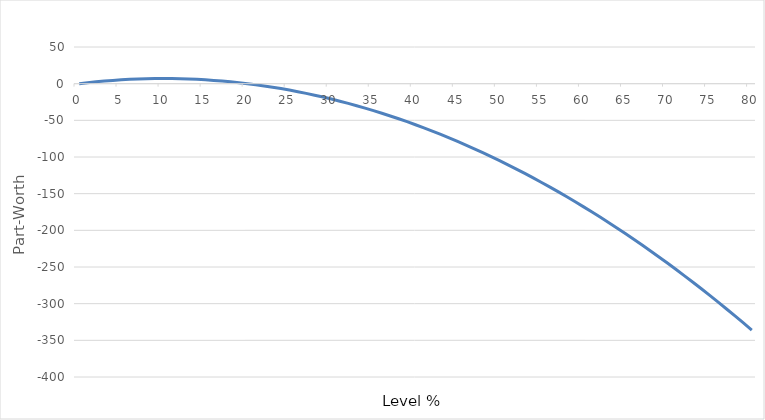
| Category | Utility |
|---|---|
| 0.0 | 0 |
| 1.0 | 1.33 |
| 2.0 | 2.52 |
| 3.0 | 3.57 |
| 4.0 | 4.48 |
| 5.0 | 5.25 |
| 6.0 | 5.88 |
| 7.0 | 6.37 |
| 8.0 | 6.72 |
| 9.0 | 6.93 |
| 10.0 | 7 |
| 11.0 | 6.93 |
| 12.0 | 6.72 |
| 13.0 | 6.37 |
| 14.0 | 5.88 |
| 15.0 | 5.25 |
| 16.0 | 4.48 |
| 17.0 | 3.57 |
| 18.0 | 2.52 |
| 19.0 | 1.33 |
| 20.0 | 0 |
| 21.0 | -1.47 |
| 22.0 | -3.08 |
| 23.0 | -4.83 |
| 24.0 | -6.72 |
| 25.0 | -8.75 |
| 26.0 | -10.92 |
| 27.0 | -13.23 |
| 28.0 | -15.68 |
| 29.0 | -18.27 |
| 30.0 | -21 |
| 31.0 | -23.87 |
| 32.0 | -26.88 |
| 33.0 | -30.03 |
| 34.0 | -33.32 |
| 35.0 | -36.75 |
| 36.0 | -40.32 |
| 37.0 | -44.03 |
| 38.0 | -47.88 |
| 39.0 | -51.87 |
| 40.0 | -56 |
| 41.0 | -60.27 |
| 42.0 | -64.68 |
| 43.0 | -69.23 |
| 44.0 | -73.92 |
| 45.0 | -78.75 |
| 46.0 | -83.72 |
| 47.0 | -88.83 |
| 48.0 | -94.08 |
| 49.0 | -99.47 |
| 50.0 | -105 |
| 51.0 | -110.67 |
| 52.0 | -116.48 |
| 53.0 | -122.43 |
| 54.0 | -128.52 |
| 55.0 | -134.75 |
| 56.0 | -141.12 |
| 57.0 | -147.63 |
| 58.0 | -154.28 |
| 59.0 | -161.07 |
| 60.0 | -168 |
| 61.0 | -175.07 |
| 62.0 | -182.28 |
| 63.0 | -189.63 |
| 64.0 | -197.12 |
| 65.0 | -204.75 |
| 66.0 | -212.52 |
| 67.0 | -220.43 |
| 68.0 | -228.48 |
| 69.0 | -236.67 |
| 70.0 | -245 |
| 71.0 | -253.47 |
| 72.0 | -262.08 |
| 73.0 | -270.83 |
| 74.0 | -279.72 |
| 75.0 | -288.75 |
| 76.0 | -297.92 |
| 77.0 | -307.23 |
| 78.0 | -316.68 |
| 79.0 | -326.27 |
| 80.0 | -336 |